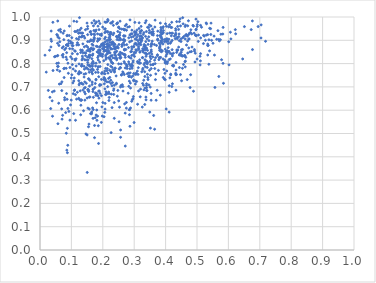
| Category | Series 0 |
|---|---|
| 0.046268062558806666 | 0.83 |
| 0.15444583976947457 | 0.529 |
| 0.4150343035598608 | 0.82 |
| 0.06674241631312527 | 0.714 |
| 0.23873353707904466 | 0.882 |
| 0.06942322071820983 | 0.684 |
| 0.3496310739609766 | 0.592 |
| 0.10916071863495891 | 0.685 |
| 0.23672624397310327 | 0.707 |
| 0.20611554420583666 | 0.768 |
| 0.4370392945514391 | 0.856 |
| 0.11030326053899353 | 0.855 |
| 0.5760919837972039 | 0.926 |
| 0.28432209928627294 | 0.602 |
| 0.25558607697910685 | 0.783 |
| 0.557083852468136 | 0.698 |
| 0.380927852296461 | 0.87 |
| 0.4499849978301955 | 0.849 |
| 0.7038593698856024 | 0.91 |
| 0.5205332399549346 | 0.886 |
| 0.05928487359170098 | 0.943 |
| 0.4029234586882615 | 0.96 |
| 0.055585097784180415 | 0.922 |
| 0.27733381200316143 | 0.779 |
| 0.07720117766723922 | 0.94 |
| 0.2651254018222873 | 0.901 |
| 0.32326188794416566 | 0.942 |
| 0.21986131163515665 | 0.721 |
| 0.06978114934306656 | 0.722 |
| 0.039890570088615296 | 0.574 |
| 0.22964503710954887 | 0.784 |
| 0.01592604561238553 | 0.836 |
| 0.33440312578226006 | 0.695 |
| 0.2861279939554904 | 0.778 |
| 0.24922439567021537 | 0.867 |
| 0.2565942767819751 | 0.782 |
| 0.155034844896076 | 0.861 |
| 0.3989253593538935 | 0.862 |
| 0.27801138823646854 | 0.757 |
| 0.42165388969332307 | 0.833 |
| 0.44393526363814373 | 0.783 |
| 0.09076828118425806 | 0.899 |
| 0.2514026375340046 | 0.882 |
| 0.31088133217762026 | 0.626 |
| 0.3224473445710434 | 0.941 |
| 0.09763300015476772 | 0.829 |
| 0.327269797363018 | 0.774 |
| 0.16332944496035628 | 0.867 |
| 0.05670778822571265 | 0.835 |
| 0.19682919449494418 | 0.883 |
| 0.10340986855159384 | 0.888 |
| 0.18325586904630908 | 0.575 |
| 0.4587079808702146 | 0.833 |
| 0.05603539613845543 | 0.887 |
| 0.1590379467454771 | 0.657 |
| 0.2973928128551725 | 0.659 |
| 0.14175849557697706 | 0.678 |
| 0.10142312682152665 | 0.911 |
| 0.3926652613748488 | 0.958 |
| 0.34888456021274283 | 0.771 |
| 0.21581495159476483 | 0.886 |
| 0.5342072566324625 | 0.837 |
| 0.26948432645099685 | 0.802 |
| 0.3435390219088914 | 0.74 |
| 0.24311679210483583 | 0.712 |
| 0.05340896477550816 | 0.801 |
| 0.2539248833185789 | 0.95 |
| 0.32687196139290997 | 0.826 |
| 0.4474463850421766 | 0.962 |
| 0.2715470045523901 | 0.446 |
| 0.06311236582321977 | 0.894 |
| 0.25157252309778066 | 0.901 |
| 0.19114507729916097 | 0.855 |
| 0.4822968521121065 | 0.852 |
| 0.30447817526712717 | 0.885 |
| 0.34009804318529024 | 0.81 |
| 0.23387174481361583 | 0.885 |
| 0.275210169718335 | 0.796 |
| 0.21197691639285265 | 0.669 |
| 0.17363885838523152 | 0.482 |
| 0.16632267267791656 | 0.721 |
| 0.11234071546425184 | 0.853 |
| 0.23281386059345266 | 0.924 |
| 0.43076572232955435 | 0.907 |
| 0.694776381821852 | 0.959 |
| 0.3117853436208943 | 0.804 |
| 0.2679546881350454 | 0.918 |
| 0.13208220698962947 | 0.644 |
| 0.17870646130817858 | 0.579 |
| 0.5291552246350656 | 0.974 |
| 0.15159002764447138 | 0.95 |
| 0.21545998359438068 | 0.843 |
| 0.18077330451677487 | 0.601 |
| 0.15517023419703668 | 0.68 |
| 0.1522763445244638 | 0.687 |
| 0.05812483713395433 | 0.788 |
| 0.5299610027890114 | 0.922 |
| 0.27547722662576946 | 0.943 |
| 0.1575366891893214 | 0.826 |
| 0.12439000503454123 | 0.799 |
| 0.08899982664697947 | 0.802 |
| 0.16896464225828012 | 0.879 |
| 0.08884104237612156 | 0.607 |
| 0.40329233318184177 | 0.895 |
| 0.16886317519616245 | 0.69 |
| 0.08545673528202202 | 0.429 |
| 0.2320861499835103 | 0.825 |
| 0.2228885994810198 | 0.891 |
| 0.1569830436882529 | 0.605 |
| 0.11652339937243794 | 0.647 |
| 0.2315203847371683 | 0.801 |
| 0.2380757933662493 | 0.838 |
| 0.4078097666478062 | 0.886 |
| 0.5098905060649903 | 0.794 |
| 0.12336108892592412 | 0.651 |
| 0.23958707086673958 | 0.87 |
| 0.1609644830833128 | 0.835 |
| 0.20738621362729504 | 0.629 |
| 0.4917672961582904 | 0.86 |
| 0.1641868084937601 | 0.585 |
| 0.08735555898104641 | 0.921 |
| 0.14399399609529906 | 0.697 |
| 0.3355525100145388 | 0.868 |
| 0.10579501068067632 | 0.777 |
| 0.2260946248825787 | 0.928 |
| 0.1314348528042918 | 0.717 |
| 0.40963238084853615 | 0.958 |
| 0.19621960901225688 | 0.757 |
| 0.1865865976590081 | 0.858 |
| 0.15039736307852214 | 0.333 |
| 0.5096249964828804 | 0.831 |
| 0.1736666915481867 | 0.923 |
| 0.16359558565530552 | 0.927 |
| 0.21883906202532288 | 0.678 |
| 0.17863197249767238 | 0.802 |
| 0.47975943329964477 | 0.752 |
| 0.15976203086230067 | 0.788 |
| 0.24798068031177667 | 0.685 |
| 0.35343479962490454 | 0.933 |
| 0.30505809407267126 | 0.931 |
| 0.3331246018985706 | 0.802 |
| 0.5343457517163476 | 0.877 |
| 0.21917633024693617 | 0.91 |
| 0.14149282720789325 | 0.776 |
| 0.2198254470803147 | 0.876 |
| 0.2602588219462547 | 0.948 |
| 0.4415390851563151 | 0.947 |
| 0.33598265907558067 | 0.917 |
| 0.3915619172878826 | 0.884 |
| 0.6764042062298984 | 0.983 |
| 0.156941806481243 | 0.895 |
| 0.156194809556365 | 0.832 |
| 0.2046023088652167 | 0.757 |
| 0.21602946669111922 | 0.796 |
| 0.3407372873804193 | 0.684 |
| 0.0627822687865669 | 0.767 |
| 0.4036413643748388 | 0.84 |
| 0.35742272447492307 | 0.896 |
| 0.42790438598585845 | 0.918 |
| 0.30142304193956737 | 0.884 |
| 0.15000025252225524 | 0.856 |
| 0.3520741387525659 | 0.75 |
| 0.1365907877211171 | 0.885 |
| 0.3059557600742734 | 0.935 |
| 0.1700810211167736 | 0.772 |
| 0.1429684562293061 | 0.643 |
| 0.17016259620019392 | 0.895 |
| 0.20294936852136136 | 0.732 |
| 0.304636165847741 | 0.887 |
| 0.3856087755657922 | 0.915 |
| 0.46259036737468695 | 0.786 |
| 0.10755562527660845 | 0.725 |
| 0.34765188911577183 | 0.844 |
| 0.4920480217770399 | 0.854 |
| 0.2550212189508192 | 0.982 |
| 0.2866850048522671 | 0.987 |
| 0.6454646681075273 | 0.82 |
| 0.22429741086059674 | 0.904 |
| 0.3178056743514279 | 0.884 |
| 0.3947092355501317 | 0.775 |
| 0.36416570211447785 | 0.882 |
| 0.12653611265096243 | 0.645 |
| 0.3310810752647674 | 0.687 |
| 0.29085216898964716 | 0.787 |
| 0.2898178962113208 | 0.928 |
| 0.09525463815732405 | 0.557 |
| 0.056530813722796 | 0.983 |
| 0.08717381939103375 | 0.522 |
| 0.4660078793938782 | 0.925 |
| 0.5432624413261633 | 0.95 |
| 0.1557745896657623 | 0.734 |
| 0.11517976100235716 | 0.79 |
| 0.3197396917676668 | 0.931 |
| 0.5446778420537252 | 0.974 |
| 0.29075948380432337 | 0.913 |
| 0.2377659628556803 | 0.849 |
| 0.1985959909854642 | 0.831 |
| 0.31371756601027045 | 0.865 |
| 0.43266544797262485 | 0.752 |
| 0.3619649520290197 | 0.577 |
| 0.24156574283963028 | 0.85 |
| 0.11984245806853477 | 0.942 |
| 0.21420872667163182 | 0.98 |
| 0.3385659981889212 | 0.863 |
| 0.38078730424650653 | 0.865 |
| 0.1463593403823824 | 0.498 |
| 0.2680233155499744 | 0.808 |
| 0.29804643680512666 | 0.726 |
| 0.27132106609679674 | 0.588 |
| 0.4776519609133978 | 0.85 |
| 0.2977977703484348 | 0.839 |
| 0.26188845853324516 | 0.709 |
| 0.5666557850917426 | 0.941 |
| 0.1400688742938011 | 0.917 |
| 0.22797267891533157 | 0.805 |
| 0.13698965128500185 | 0.711 |
| 0.39226023195666226 | 0.82 |
| 0.39652692385421806 | 0.894 |
| 0.43539661084322423 | 0.98 |
| 0.16628132936449957 | 0.792 |
| 0.3746133864565788 | 0.904 |
| 0.33325944433163834 | 0.872 |
| 0.1907730616545804 | 0.972 |
| 0.44403127699912903 | 0.98 |
| 0.25469362071726753 | 0.933 |
| 0.45354711319551944 | 0.832 |
| 0.2167492553460958 | 0.899 |
| 0.5380218527715173 | 0.902 |
| 0.34401133997028566 | 0.731 |
| 0.28463816553366295 | 0.827 |
| 0.15464769601705075 | 0.684 |
| 0.4436532511793375 | 0.837 |
| 0.04937925260672993 | 0.831 |
| 0.32686878358050264 | 0.715 |
| 0.11202540390248672 | 0.814 |
| 0.4537019478834474 | 0.78 |
| 0.1251782783285904 | 0.766 |
| 0.21663730299241668 | 0.759 |
| 0.335170648870848 | 0.975 |
| 0.2442064388217462 | 0.816 |
| 0.18389359609989542 | 0.826 |
| 0.11708531992063997 | 0.98 |
| 0.20317636132916617 | 0.812 |
| 0.04151578230001618 | 0.77 |
| 0.32709963926407115 | 0.864 |
| 0.05487713907709957 | 0.833 |
| 0.3393988163067547 | 0.713 |
| 0.45575954319227385 | 0.971 |
| 0.23175221660750456 | 0.98 |
| 0.5696332832846459 | 0.904 |
| 0.34697926529110823 | 0.899 |
| 0.38453471859650323 | 0.826 |
| 0.450392480975602 | 0.859 |
| 0.2568832686062431 | 0.902 |
| 0.1669537399652996 | 0.756 |
| 0.22229669347436753 | 0.824 |
| 0.36552035184663123 | 0.779 |
| 0.30744433104036617 | 0.855 |
| 0.4388327743636966 | 0.858 |
| 0.0906312451646103 | 0.886 |
| 0.1323684923451881 | 0.931 |
| 0.30102204744229066 | 0.831 |
| 0.21484230505039492 | 0.935 |
| 0.22168332175292882 | 0.772 |
| 0.16581484753196174 | 0.883 |
| 0.3127029589032515 | 0.897 |
| 0.6010916615840542 | 0.894 |
| 0.08925039863534989 | 0.876 |
| 0.1456417012680249 | 0.845 |
| 0.3821911725141265 | 0.872 |
| 0.3370680034270672 | 0.894 |
| 0.2751944640066212 | 0.968 |
| 0.34044961320489053 | 0.84 |
| 0.0735700989792083 | 0.828 |
| 0.5400570128121294 | 0.855 |
| 0.1327593052540924 | 0.789 |
| 0.26388188884944064 | 0.702 |
| 0.34243486108704513 | 0.857 |
| 0.1358746248422591 | 0.931 |
| 0.3192535185751103 | 0.657 |
| 0.15167111743775785 | 0.96 |
| 0.21062170726634455 | 0.824 |
| 0.07815056138238252 | 0.78 |
| 0.554338500112225 | 0.918 |
| 0.27158543310835814 | 0.962 |
| 0.44738097522649034 | 0.753 |
| 0.5378283328998473 | 0.797 |
| 0.24556447694753836 | 0.904 |
| 0.3516476951610098 | 0.832 |
| 0.3303292867926615 | 0.729 |
| 0.2709996470132836 | 0.919 |
| 0.09942983931373173 | 0.643 |
| 0.2089975392504595 | 0.779 |
| 0.3574590379468535 | 0.929 |
| 0.23974047447222224 | 0.78 |
| 0.03476337535907037 | 0.871 |
| 0.2031954921226108 | 0.861 |
| 0.22585629824579145 | 0.715 |
| 0.15262425118906398 | 0.609 |
| 0.5822682298114285 | 0.927 |
| 0.3344712304977643 | 0.816 |
| 0.4688757767511551 | 0.731 |
| 0.2595616838802163 | 0.753 |
| 0.2635693009785419 | 0.764 |
| 0.4612470421913196 | 0.835 |
| 0.3651177196446471 | 0.815 |
| 0.11634427759924548 | 0.907 |
| 0.504772809078464 | 0.923 |
| 0.1522650894550207 | 0.794 |
| 0.24350658348405163 | 0.916 |
| 0.04533267249607109 | 0.682 |
| 0.3508918902831092 | 0.829 |
| 0.21318863902179574 | 0.77 |
| 0.4175306913771015 | 0.931 |
| 0.20455059578158896 | 0.881 |
| 0.14688025146947759 | 0.815 |
| 0.3753666103039761 | 0.9 |
| 0.6231436607795283 | 0.928 |
| 0.1879322211097313 | 0.844 |
| 0.5342059542936813 | 0.884 |
| 0.2248274833511007 | 0.832 |
| 0.22511281606354594 | 0.816 |
| 0.2052404249007238 | 0.737 |
| 0.3988693789171235 | 0.731 |
| 0.22937872144014027 | 0.891 |
| 0.2607804474261757 | 0.845 |
| 0.326177076767313 | 0.826 |
| 0.17140306203174305 | 0.903 |
| 0.2463047550742129 | 0.66 |
| 0.32957463360224426 | 0.707 |
| 0.23603809308801604 | 0.886 |
| 0.18432046183109652 | 0.907 |
| 0.0535412201412826 | 0.925 |
| 0.42004949882233467 | 0.842 |
| 0.3077490141520193 | 0.723 |
| 0.39049511472935206 | 0.902 |
| 0.46429498552500004 | 0.827 |
| 0.1854134180952305 | 0.832 |
| 0.18288265072692933 | 0.873 |
| 0.15607017778439902 | 0.541 |
| 0.2818183266158252 | 0.869 |
| 0.1611950167929358 | 0.773 |
| 0.20898035990514408 | 0.833 |
| 0.43649477325090347 | 0.912 |
| 0.21577869051090393 | 0.989 |
| 0.3267306589832508 | 0.91 |
| 0.24825000738444913 | 0.913 |
| 0.17296125673371976 | 0.907 |
| 0.268522841592151 | 0.944 |
| 0.14266556298780364 | 0.721 |
| 0.26573572433151804 | 0.841 |
| 0.4975304909347029 | 0.948 |
| 0.31992681693600056 | 0.802 |
| 0.2700794013497456 | 0.947 |
| 0.082953866767015 | 0.828 |
| 0.1173016543088361 | 0.88 |
| 0.15877574943345862 | 0.728 |
| 0.3771550898087006 | 0.771 |
| 0.18317021155805346 | 0.896 |
| 0.3835967985189226 | 0.934 |
| 0.3931133277175376 | 0.942 |
| 0.4700354854842582 | 0.897 |
| 0.23717238071614544 | 0.764 |
| 0.22946320117663022 | 0.611 |
| 0.3307778487758911 | 0.875 |
| 0.32349960643039066 | 0.903 |
| 0.4841435257126896 | 0.871 |
| 0.30142377093140327 | 0.936 |
| 0.16656371424580485 | 0.777 |
| 0.2049217911006075 | 0.713 |
| 0.19570120068149321 | 0.927 |
| 0.2593986706625988 | 0.751 |
| 0.08848688967715135 | 0.449 |
| 0.313170184315091 | 0.783 |
| 0.5510224466480231 | 0.887 |
| 0.3856995984596219 | 0.946 |
| 0.4080955984972874 | 0.868 |
| 0.21574537372239855 | 0.937 |
| 0.05865411027810541 | 0.802 |
| 0.2467229853780708 | 0.975 |
| 0.2532740639227057 | 0.613 |
| 0.2663542234033035 | 0.919 |
| 0.43525198318159797 | 0.848 |
| 0.31548434214617616 | 0.883 |
| 0.45698970738831646 | 0.796 |
| 0.08476682173321959 | 0.881 |
| 0.19867721057827592 | 0.865 |
| 0.35341681475866504 | 0.961 |
| 0.15170454078239026 | 0.895 |
| 0.28274710677074344 | 0.911 |
| 0.5402280879623256 | 0.951 |
| 0.21029111610409335 | 0.679 |
| 0.310080954755209 | 0.768 |
| 0.17097866417863072 | 0.801 |
| 0.4944320529594358 | 0.845 |
| 0.20010418676244435 | 0.633 |
| 0.24614184243529358 | 0.873 |
| 0.2574910950635678 | 0.827 |
| 0.2825163753858875 | 0.746 |
| 0.28828533469199347 | 0.695 |
| 0.3083978276685305 | 0.944 |
| 0.27637161647850583 | 0.881 |
| 0.46905293812916504 | 0.918 |
| 0.6019764608664719 | 0.795 |
| 0.23170506783224798 | 0.893 |
| 0.2506210203043103 | 0.64 |
| 0.18705573278365173 | 0.744 |
| 0.2657898732824775 | 0.947 |
| 0.22661387531175714 | 0.81 |
| 0.356119726196497 | 0.841 |
| 0.20591056023520315 | 0.906 |
| 0.11313059340277765 | 0.557 |
| 0.10312596095646553 | 0.796 |
| 0.1447886377708224 | 0.945 |
| 0.33343958855642 | 0.765 |
| 0.05711174750272119 | 0.542 |
| 0.3913035747499565 | 0.954 |
| 0.15458251312515647 | 0.735 |
| 0.06596825338998147 | 0.936 |
| 0.16189887749800558 | 0.898 |
| 0.4070944880536249 | 0.849 |
| 0.1341913738942181 | 0.854 |
| 0.14305238755597516 | 0.847 |
| 0.3340081953025489 | 0.745 |
| 0.339378493421822 | 0.706 |
| 0.29622696535151294 | 0.649 |
| 0.41271810598477576 | 0.967 |
| 0.4020374608055196 | 0.807 |
| 0.0970003070940958 | 0.895 |
| 0.7042927508019918 | 0.966 |
| 0.26962132417572926 | 0.627 |
| 0.26867341155044877 | 0.859 |
| 0.3739229840717786 | 0.834 |
| 0.19256032554830071 | 0.874 |
| 0.4430137940246943 | 0.927 |
| 0.1620404606415582 | 0.902 |
| 0.13335081190647824 | 0.797 |
| 0.3982078469144986 | 0.806 |
| 0.12463398594731412 | 0.759 |
| 0.3172561176222066 | 0.816 |
| 0.2554214815466187 | 0.907 |
| 0.24011772316889868 | 0.864 |
| 0.10265884437000028 | 0.878 |
| 0.20451019834863238 | 0.859 |
| 0.16474575597252472 | 0.764 |
| 0.2501957325651698 | 0.917 |
| 0.26877427201413384 | 0.861 |
| 0.46246913215822083 | 0.906 |
| 0.23245029399424466 | 0.888 |
| 0.19038250110472243 | 0.844 |
| 0.0848728293092047 | 0.847 |
| 0.21660438875694776 | 0.984 |
| 0.5842971265258475 | 0.715 |
| 0.08724439070209888 | 0.418 |
| 0.24439636868090386 | 0.853 |
| 0.23167117103335866 | 0.886 |
| 0.3016598981969577 | 0.935 |
| 0.2160656694423938 | 0.864 |
| 0.4049728828208389 | 0.8 |
| 0.1337113652768761 | 0.816 |
| 0.3139937056733155 | 0.888 |
| 0.320215288478911 | 0.69 |
| 0.7183277874992718 | 0.896 |
| 0.29311460211797913 | 0.78 |
| 0.33586936576724924 | 0.876 |
| 0.26955419838320893 | 0.897 |
| 0.2477369794571106 | 0.938 |
| 0.09319412863461773 | 0.92 |
| 0.10908058532289344 | 0.738 |
| 0.1568172998870644 | 0.763 |
| 0.34149951393735356 | 0.799 |
| 0.3888711615479611 | 0.928 |
| 0.3377189427744799 | 0.844 |
| 0.1374664020492783 | 0.846 |
| 0.4608536053960657 | 0.834 |
| 0.2984021130620649 | 0.73 |
| 0.15661395811659273 | 0.854 |
| 0.3499598438999735 | 0.809 |
| 0.10374195858385071 | 0.863 |
| 0.13477063357106833 | 0.858 |
| 0.5003083997597775 | 0.82 |
| 0.07860013790697618 | 0.86 |
| 0.2608766648686738 | 0.873 |
| 0.30673801867839134 | 0.759 |
| 0.4635031054318841 | 0.965 |
| 0.40363635084517213 | 0.768 |
| 0.17586420443602746 | 0.568 |
| 0.17715760629922794 | 0.762 |
| 0.2861005254034622 | 0.922 |
| 0.3039025601748614 | 0.923 |
| 0.17702436656689036 | 0.79 |
| 0.23498604207052765 | 0.931 |
| 0.22383918661314617 | 0.869 |
| 0.05499731057123114 | 0.773 |
| 0.4965853685527166 | 0.991 |
| 0.36874634436102816 | 0.756 |
| 0.11924837635686136 | 0.841 |
| 0.1856915639571146 | 0.533 |
| 0.4319748272249436 | 0.924 |
| 0.16856171163195022 | 0.68 |
| 0.4384477614552913 | 0.96 |
| 0.1258042908669298 | 0.997 |
| 0.08228750832912368 | 0.866 |
| 0.16517029713771303 | 0.801 |
| 0.5440346429764786 | 0.925 |
| 0.3667218519726374 | 0.8 |
| 0.28718613126640846 | 0.76 |
| 0.19957176866075976 | 0.957 |
| 0.2352200202615432 | 0.691 |
| 0.3397257197696193 | 0.684 |
| 0.2292486765192291 | 0.863 |
| 0.17868717695476477 | 0.944 |
| 0.41950906867274584 | 0.977 |
| 0.31891598284320477 | 0.852 |
| 0.28768615824968546 | 0.716 |
| 0.49355495791529747 | 0.807 |
| 0.3864557752961958 | 0.89 |
| 0.25150128667874994 | 0.922 |
| 0.22936062740891083 | 0.835 |
| 0.2849339353787129 | 0.581 |
| 0.25675017643799836 | 0.515 |
| 0.3732887550282874 | 0.685 |
| 0.17473376158220266 | 0.697 |
| 0.123081769557844 | 0.881 |
| 0.1937545946504975 | 0.843 |
| 0.16593595405383066 | 0.863 |
| 0.1060071292081467 | 0.671 |
| 0.36051005906103595 | 0.922 |
| 0.1422098041640696 | 0.817 |
| 0.18520040482330968 | 0.762 |
| 0.43200009702550024 | 0.925 |
| 0.44911715762797244 | 0.895 |
| 0.422225695477337 | 0.93 |
| 0.07575683294634072 | 0.778 |
| 0.24426887782183437 | 0.916 |
| 0.16954393438383442 | 0.603 |
| 0.48051726487892743 | 0.945 |
| 0.4887619032062194 | 0.681 |
| 0.31393452161519453 | 0.683 |
| 0.44380550754983317 | 0.898 |
| 0.34805253498649535 | 0.943 |
| 0.14779501086736946 | 0.876 |
| 0.16136167330222018 | 0.938 |
| 0.382547713688948 | 0.88 |
| 0.1698956934597945 | 0.655 |
| 0.19769182245374795 | 0.762 |
| 0.30377063419639616 | 0.712 |
| 0.42515791243712486 | 0.789 |
| 0.06039821702559944 | 0.878 |
| 0.18331314776740215 | 0.927 |
| 0.07338584864194198 | 0.84 |
| 0.12255055998886766 | 0.904 |
| 0.2067102503804943 | 0.692 |
| 0.3897390977718064 | 0.854 |
| 0.23485940310865172 | 0.668 |
| 0.31399387674808266 | 0.872 |
| 0.19832390882318063 | 0.575 |
| 0.27513602234310186 | 0.633 |
| 0.1846855201622073 | 0.961 |
| 0.4329867920303049 | 0.686 |
| 0.11298473594723879 | 0.768 |
| 0.461837182726506 | 0.808 |
| 0.3862853156741235 | 0.851 |
| 0.416414306375381 | 0.956 |
| 0.2890783162461392 | 0.851 |
| 0.4112560991460569 | 0.817 |
| 0.12349609850392607 | 0.726 |
| 0.5011431598211572 | 0.967 |
| 0.19398030236502406 | 0.709 |
| 0.4174510783887132 | 0.893 |
| 0.21822974185848876 | 0.736 |
| 0.6063149396590678 | 0.935 |
| 0.15212944026298414 | 0.805 |
| 0.5209348852205687 | 0.921 |
| 0.36040206601878766 | 0.937 |
| 0.311818154745202 | 0.924 |
| 0.4321003331065758 | 0.758 |
| 0.2643591760974279 | 0.682 |
| 0.21316469010338612 | 0.899 |
| 0.16348116153609082 | 0.925 |
| 0.33524441369771296 | 0.859 |
| 0.2554476672896593 | 0.848 |
| 0.1667248506608786 | 0.788 |
| 0.6726869025704668 | 0.946 |
| 0.16865950715689493 | 0.81 |
| 0.6510459487691821 | 0.959 |
| 0.30571539074743004 | 0.86 |
| 0.3275879651052894 | 0.858 |
| 0.4249444628368 | 0.844 |
| 0.5341063068204944 | 0.924 |
| 0.19382499209423143 | 0.835 |
| 0.4218868933707387 | 0.792 |
| 0.19717377607876385 | 0.614 |
| 0.2060783061299155 | 0.871 |
| 0.5112659301554505 | 0.843 |
| 0.17833921254989316 | 0.732 |
| 0.29619921919085745 | 0.806 |
| 0.4182879958483754 | 0.919 |
| 0.22724824467191806 | 0.669 |
| 0.08378048301691587 | 0.501 |
| 0.40493486664843015 | 0.848 |
| 0.1262208485011621 | 0.715 |
| 0.40292588201496593 | 0.905 |
| 0.31576566852016485 | 0.975 |
| 0.09030358593298637 | 0.758 |
| 0.212044707545047 | 0.84 |
| 0.3748736328486616 | 0.904 |
| 0.20974690437605392 | 0.938 |
| 0.13512621069860564 | 0.832 |
| 0.35533217941180417 | 0.887 |
| 0.3822947729956985 | 0.92 |
| 0.3022232714869316 | 0.977 |
| 0.27091456762199806 | 0.836 |
| 0.13292089288794995 | 0.715 |
| 0.17822092192506245 | 0.73 |
| 0.21219752944248182 | 0.883 |
| 0.17603127308645306 | 0.715 |
| 0.502892462067273 | 0.98 |
| 0.12816354758588422 | 0.683 |
| 0.28226183021205287 | 0.83 |
| 0.09739277111897804 | 0.623 |
| 0.33155697311678134 | 0.796 |
| 0.29148955735274273 | 0.852 |
| 0.2608063469825046 | 0.882 |
| 0.28238702911554814 | 0.808 |
| 0.34634518977490325 | 0.955 |
| 0.14496358583012037 | 0.834 |
| 0.3209612860012775 | 0.881 |
| 0.3483496047423311 | 0.966 |
| 0.33796274254819536 | 0.806 |
| 0.14025873591699634 | 0.755 |
| 0.1702705525321122 | 0.901 |
| 0.48710809997959525 | 0.964 |
| 0.1442452679455295 | 0.67 |
| 0.3857066541028594 | 0.859 |
| 0.32054254982345065 | 0.899 |
| 0.2824531528226242 | 0.759 |
| 0.22327284447882478 | 0.933 |
| 0.33924241726511284 | 0.696 |
| 0.1906634216058457 | 0.924 |
| 0.46650162943073514 | 0.88 |
| 0.17973462290332531 | 0.979 |
| 0.2020048233232632 | 0.888 |
| 0.08175433622042816 | 0.59 |
| 0.10304526883595211 | 0.843 |
| 0.401855147177665 | 0.605 |
| 0.340870875855081 | 0.906 |
| 0.23073678006861498 | 0.718 |
| 0.27496328901229283 | 0.609 |
| 0.22564996626707867 | 0.728 |
| 0.15115153615494592 | 0.828 |
| 0.3275482513296387 | 0.78 |
| 0.321920598800998 | 0.96 |
| 0.34211975895483515 | 0.754 |
| 0.16967982794972902 | 0.691 |
| 0.3926380635524722 | 0.74 |
| 0.26567956314594654 | 0.889 |
| 0.2918822303066001 | 0.872 |
| 0.5356190905247703 | 0.878 |
| 0.1652055262590788 | 0.975 |
| 0.35672487788124907 | 0.925 |
| 0.18304347078001404 | 0.775 |
| 0.08576110630541778 | 0.919 |
| 0.2700096938670017 | 0.859 |
| 0.2777091069986768 | 0.789 |
| 0.19149981235073055 | 0.788 |
| 0.1310623932511058 | 0.914 |
| 0.1840714974007418 | 0.849 |
| 0.17934389245976134 | 0.874 |
| 0.30369374535792704 | 0.754 |
| 0.38318740681664165 | 0.665 |
| 0.1847995781743622 | 0.662 |
| 0.24986579225134342 | 0.955 |
| 0.1953498021948037 | 0.921 |
| 0.15307027141006246 | 0.816 |
| 0.1593734621087013 | 0.936 |
| 0.33946353198506796 | 0.866 |
| 0.1684755405593268 | 0.841 |
| 0.31741442060717173 | 0.916 |
| 0.20727097382518356 | 0.605 |
| 0.23448758933348268 | 0.876 |
| 0.3924912679727951 | 0.932 |
| 0.19010337852176284 | 0.705 |
| 0.1601920864336318 | 0.861 |
| 0.13210763156484817 | 0.791 |
| 0.2975666178151629 | 0.873 |
| 0.3610420194893824 | 0.928 |
| 0.5144046540107143 | 0.956 |
| 0.24343117490339328 | 0.716 |
| 0.3345770877336258 | 0.844 |
| 0.21548153789101288 | 0.701 |
| 0.18799550867711612 | 0.946 |
| 0.47410921865832156 | 0.925 |
| 0.2827160297201121 | 0.702 |
| 0.22049280440074337 | 0.925 |
| 0.35653585855424774 | 0.883 |
| 0.25842839117309346 | 0.799 |
| 0.3786800530086971 | 0.817 |
| 0.32977346963343757 | 0.862 |
| 0.2655936638312023 | 0.903 |
| 0.22375616015297572 | 0.924 |
| 0.23368963403617038 | 0.964 |
| 0.46226448216033456 | 0.959 |
| 0.18005809222949243 | 0.632 |
| 0.1899821970188057 | 0.807 |
| 0.1568940085306637 | 0.656 |
| 0.24245003802071796 | 0.747 |
| 0.15954193529417582 | 0.853 |
| 0.17662315590839806 | 0.938 |
| 0.4980247227003447 | 0.92 |
| 0.12689333543257364 | 0.945 |
| 0.07852047321643896 | 0.654 |
| 0.20019879057515655 | 0.84 |
| 0.31589339292518315 | 0.801 |
| 0.2945275091856939 | 0.792 |
| 0.4415491155874327 | 0.871 |
| 0.13559807176074334 | 0.823 |
| 0.33727014005651734 | 0.656 |
| 0.07853675361370205 | 0.644 |
| 0.07417989959963311 | 0.872 |
| 0.3041325658666796 | 0.846 |
| 0.47581021356491326 | 0.93 |
| 0.4324679603211432 | 0.943 |
| 0.32877833217142227 | 0.85 |
| 0.17252027887548693 | 0.985 |
| 0.3031317028387259 | 0.924 |
| 0.3832181193480846 | 0.974 |
| 0.14740145476000222 | 0.716 |
| 0.12783851313035965 | 0.932 |
| 0.16706366726377686 | 0.835 |
| 0.23843434219624693 | 0.863 |
| 0.490795130027862 | 0.93 |
| 0.29277927084200384 | 0.943 |
| 0.41139852097247054 | 0.592 |
| 0.15765733213500666 | 0.703 |
| 0.43204981681993604 | 0.95 |
| 0.17382435642306737 | 0.535 |
| 0.2342012597206582 | 0.685 |
| 0.18775566196554427 | 0.652 |
| 0.4208284613540316 | 0.899 |
| 0.4950403615386666 | 0.922 |
| 0.2445835158621137 | 0.821 |
| 0.20835145974296443 | 0.725 |
| 0.15396187653832505 | 0.776 |
| 0.38107102939259574 | 0.824 |
| 0.23801954761459732 | 0.823 |
| 0.3530761988061031 | 0.821 |
| 0.4145528532161499 | 0.844 |
| 0.21557959756539813 | 0.849 |
| 0.31035487393506445 | 0.809 |
| 0.19926059325561896 | 0.884 |
| 0.21970569208824342 | 0.671 |
| 0.41358087671006105 | 0.739 |
| 0.4741595009587143 | 0.904 |
| 0.21643742923510134 | 0.849 |
| 0.24607792124916972 | 0.972 |
| 0.22648013732499683 | 0.504 |
| 0.3422745659730503 | 0.804 |
| 0.21432033778282766 | 0.778 |
| 0.4963798483046624 | 0.945 |
| 0.21583155859745073 | 0.873 |
| 0.3340933248504816 | 0.864 |
| 0.20695039231460233 | 0.756 |
| 0.5695732821629517 | 0.745 |
| 0.31433940692220574 | 0.861 |
| 0.3082470756639043 | 0.914 |
| 0.031548304704047014 | 0.655 |
| 0.3039367915380027 | 0.725 |
| 0.35340050678847623 | 0.849 |
| 0.180393023578708 | 0.672 |
| 0.3584512917651618 | 0.948 |
| 0.4330767303335039 | 0.805 |
| 0.219523109943066 | 0.642 |
| 0.18556706000154055 | 0.815 |
| 0.30853213458960316 | 0.88 |
| 0.21992877870156124 | 0.848 |
| 0.19563825657415201 | 0.662 |
| 0.5465225601822931 | 0.9 |
| 0.30683137285700723 | 0.755 |
| 0.2080214502530512 | 0.732 |
| 0.2795459779429761 | 0.957 |
| 0.13503872319486643 | 0.918 |
| 0.039481342183408374 | 0.679 |
| 0.33090519008455 | 0.933 |
| 0.4547012932985377 | 0.911 |
| 0.20687871939275015 | 0.978 |
| 0.23869152678324979 | 0.781 |
| 0.3004418209902061 | 0.848 |
| 0.2957656022941897 | 0.747 |
| 0.2808189795644459 | 0.673 |
| 0.41952109269777926 | 0.955 |
| 0.0736370593144845 | 0.93 |
| 0.11902682523209873 | 0.677 |
| 0.20556420891274918 | 0.948 |
| 0.30800506845217324 | 0.903 |
| 0.5829258833868952 | 0.801 |
| 0.24551251814192532 | 0.869 |
| 0.29346776992479895 | 0.786 |
| 0.22522737532351755 | 0.789 |
| 0.17584230127515776 | 0.972 |
| 0.462986104629318 | 0.811 |
| 0.38567695968794014 | 0.897 |
| 0.3741336555873215 | 0.92 |
| 0.4049609362513158 | 0.929 |
| 0.38529723900726376 | 0.941 |
| 0.4252588884011713 | 0.793 |
| 0.35415298886926716 | 0.779 |
| 0.19087094517696224 | 0.841 |
| 0.2539656573904715 | 0.922 |
| 0.4420691742028531 | 0.916 |
| 0.3608823631041692 | 0.797 |
| 0.0648723250719877 | 0.947 |
| 0.1501815818685026 | 0.652 |
| 0.1849151701591807 | 0.787 |
| 0.06163796815753175 | 0.712 |
| 0.23651429420192438 | 0.565 |
| 0.2006256817423887 | 0.877 |
| 0.15200697040021904 | 0.87 |
| 0.29859242740175673 | 0.757 |
| 0.2100597790138965 | 0.977 |
| 0.1597972547621278 | 0.861 |
| 0.13019338818545656 | 0.621 |
| 0.13874607851819043 | 0.598 |
| 0.3175668152273986 | 0.905 |
| 0.4699144833108464 | 0.92 |
| 0.18587145344322742 | 0.785 |
| 0.10141396309891981 | 0.752 |
| 0.40125556302175625 | 0.852 |
| 0.23760284804326093 | 0.777 |
| 0.5266308888007221 | 0.9 |
| 0.4360819397296447 | 0.859 |
| 0.08392331073464121 | 0.88 |
| 0.40187245664852433 | 0.896 |
| 0.17027436172299437 | 0.962 |
| 0.35343083969081424 | 0.874 |
| 0.07083057499788681 | 0.867 |
| 0.3666027960266799 | 0.986 |
| 0.05955811989894322 | 0.63 |
| 0.11093892048877729 | 0.938 |
| 0.32575923064209356 | 0.613 |
| 0.11496252047711542 | 0.821 |
| 0.08531046713934742 | 0.818 |
| 0.44896658671305856 | 0.906 |
| 0.2916806482993185 | 0.898 |
| 0.12200761571576535 | 0.758 |
| 0.3799533425718219 | 0.888 |
| 0.2042083711531335 | 0.74 |
| 0.26768603258225654 | 0.919 |
| 0.030539268529438557 | 0.857 |
| 0.2520556704887461 | 0.777 |
| 0.6220967756778046 | 0.946 |
| 0.2714378217019272 | 0.827 |
| 0.5745638308306 | 0.902 |
| 0.32701611123131025 | 0.856 |
| 0.4832846344231664 | 0.927 |
| 0.530513967075422 | 0.971 |
| 0.35172828866393735 | 0.523 |
| 0.4464026006148961 | 0.992 |
| 0.5040576198105355 | 0.895 |
| 0.510885692166886 | 0.812 |
| 0.14030704112913583 | 0.788 |
| 0.12382645856670027 | 0.755 |
| 0.14978217512364855 | 0.974 |
| 0.22329271870252387 | 0.846 |
| 0.3539489865912594 | 0.672 |
| 0.2919634380849342 | 0.797 |
| 0.33548566918911615 | 0.787 |
| 0.31212836790278964 | 0.754 |
| 0.3699191462002712 | 0.643 |
| 0.2127578380893429 | 0.673 |
| 0.5003513733454659 | 0.959 |
| 0.1782203702267532 | 0.664 |
| 0.2900830777280232 | 0.823 |
| 0.1366064260467279 | 0.687 |
| 0.23646095885791385 | 0.633 |
| 0.5229751119913346 | 0.918 |
| 0.25805836534671234 | 0.706 |
| 0.28410281848375496 | 0.798 |
| 0.2758895681311442 | 0.79 |
| 0.22831107284317376 | 0.974 |
| 0.3289034195665428 | 0.925 |
| 0.4704224924016345 | 0.962 |
| 0.3977208070909327 | 0.758 |
| 0.20825248253228745 | 0.913 |
| 0.19565856051784714 | 0.732 |
| 0.29312528659726256 | 0.928 |
| 0.22949997168817338 | 0.705 |
| 0.07596321971950237 | 0.903 |
| 0.35447447144542454 | 0.853 |
| 0.07206752372738545 | 0.578 |
| 0.39619979711731357 | 0.734 |
| 0.1518328252485983 | 0.924 |
| 0.1471350502093075 | 0.781 |
| 0.0864384785584964 | 0.647 |
| 0.20395609188354558 | 0.872 |
| 0.19898629096390308 | 0.882 |
| 0.12529482363616873 | 0.914 |
| 0.4503791865639928 | 0.837 |
| 0.09462630658953253 | 0.864 |
| 0.2695387771422517 | 0.839 |
| 0.3526882003462607 | 0.795 |
| 0.22232359062462947 | 0.741 |
| 0.5112239963328259 | 0.964 |
| 0.4207941615592171 | 0.86 |
| 0.14132324777806715 | 0.872 |
| 0.18977868918711926 | 0.871 |
| 0.19021559433232693 | 0.71 |
| 0.3478522262212901 | 0.932 |
| 0.2704279427907058 | 0.838 |
| 0.3204906887305178 | 0.918 |
| 0.4373352227598748 | 0.907 |
| 0.4063148807584904 | 0.807 |
| 0.3750531991091598 | 0.939 |
| 0.1959872419999158 | 0.882 |
| 0.2969513468591456 | 0.916 |
| 0.3380183313702547 | 0.984 |
| 0.22085676267914667 | 0.901 |
| 0.4544902451923182 | 0.997 |
| 0.19080000289587207 | 0.836 |
| 0.1572142945922801 | 0.837 |
| 0.6079514101065169 | 0.906 |
| 0.4105026574064674 | 0.905 |
| 0.3996207212382572 | 0.971 |
| 0.21339015741679268 | 0.721 |
| 0.10808519946490691 | 0.982 |
| 0.5116615774330426 | 0.91 |
| 0.36811017715798444 | 0.825 |
| 0.1117029318709909 | 0.819 |
| 0.36579380523621474 | 0.957 |
| 0.2538749499049321 | 0.825 |
| 0.2278277447559105 | 0.883 |
| 0.14049455612614792 | 0.742 |
| 0.28541292575377586 | 0.603 |
| 0.24162893200739155 | 0.834 |
| 0.41633283564249146 | 0.752 |
| 0.12452122888951012 | 0.709 |
| 0.33873139315176637 | 0.938 |
| 0.22588435076108215 | 0.933 |
| 0.3975917632020032 | 0.815 |
| 0.12980926272566584 | 0.848 |
| 0.2313827059608694 | 0.802 |
| 0.45404095985344495 | 0.861 |
| 0.1295621469911118 | 0.58 |
| 0.35427417250856297 | 0.859 |
| 0.3239901302113758 | 0.765 |
| 0.2518676452538243 | 0.55 |
| 0.14148539468200938 | 0.695 |
| 0.3711100087942615 | 0.878 |
| 0.2508255449523519 | 0.957 |
| 0.26528826138933015 | 0.76 |
| 0.472692042752727 | 0.984 |
| 0.2362793428782768 | 0.865 |
| 0.20984450252341125 | 0.819 |
| 0.22252823566402802 | 0.915 |
| 0.3676830410095353 | 0.731 |
| 0.4579562183304149 | 0.916 |
| 0.22036465821373674 | 0.655 |
| 0.18740633977416588 | 0.982 |
| 0.19146450250132163 | 0.672 |
| 0.17122106930170555 | 0.864 |
| 0.26147382056080415 | 0.88 |
| 0.2505588673294642 | 0.799 |
| 0.13471620953098162 | 0.917 |
| 0.404449742358293 | 0.907 |
| 0.2690584376807198 | 0.88 |
| 0.4745320715422652 | 0.907 |
| 0.17282683402986432 | 0.912 |
| 0.47052594905087197 | 0.845 |
| 0.4780017408801537 | 0.697 |
| 0.35913170503617686 | 0.829 |
| 0.22064207727053686 | 0.878 |
| 0.21789703035745622 | 0.825 |
| 0.026506114111864654 | 0.685 |
| 0.31884058715615005 | 0.938 |
| 0.16887727008569375 | 0.565 |
| 0.5831906001822328 | 0.955 |
| 0.15361088600900163 | 0.689 |
| 0.16829847539779985 | 0.859 |
| 0.2986416907296292 | 0.872 |
| 0.03556647590489803 | 0.94 |
| 0.4795505260930566 | 0.933 |
| 0.3441006827452957 | 0.882 |
| 0.2882670947899286 | 0.791 |
| 0.292035744130812 | 0.638 |
| 0.3912806586403028 | 0.933 |
| 0.2532887176949078 | 0.912 |
| 0.16530960219527469 | 0.821 |
| 0.10743029475808152 | 0.585 |
| 0.0953880236087501 | 0.783 |
| 0.3426165945131371 | 0.956 |
| 0.14560870273062998 | 0.757 |
| 0.43231787703721214 | 0.93 |
| 0.41108163354274974 | 0.853 |
| 0.4634799240070552 | 0.921 |
| 0.5782837042142918 | 0.817 |
| 0.5556159387195828 | 0.837 |
| 0.17243581384446716 | 0.928 |
| 0.16100514578687464 | 0.585 |
| 0.2997431681354322 | 0.547 |
| 0.38746309531425094 | 0.892 |
| 0.38469458905116793 | 0.913 |
| 0.20872861069479165 | 0.667 |
| 0.055860830613130186 | 0.788 |
| 0.4011953975903376 | 0.832 |
| 0.34144942703913417 | 0.783 |
| 0.4058286359302876 | 0.855 |
| 0.20790997681594803 | 0.893 |
| 0.3809498328351757 | 0.857 |
| 0.08450136998947189 | 0.671 |
| 0.3849569610126907 | 0.897 |
| 0.09958009343225838 | 0.739 |
| 0.3993624690524623 | 0.802 |
| 0.1674245010687283 | 0.61 |
| 0.2441531040935705 | 0.97 |
| 0.12424603896143827 | 0.932 |
| 0.16897995729769755 | 0.86 |
| 0.08336334487008135 | 0.78 |
| 0.3872771304510616 | 0.926 |
| 0.13187026147540126 | 0.642 |
| 0.09385446900548167 | 0.961 |
| 0.03658253745358808 | 0.896 |
| 0.07090132725409126 | 0.835 |
| 0.2064321502433336 | 0.591 |
| 0.09845807405342144 | 0.888 |
| 0.3336373400435273 | 0.625 |
| 0.34687157972467286 | 0.709 |
| 0.22479682619733432 | 0.974 |
| 0.034040424334154995 | 0.607 |
| 0.1867487655977954 | 0.682 |
| 0.18141172139002415 | 0.556 |
| 0.4345762001959278 | 0.753 |
| 0.48864874539801917 | 0.961 |
| 0.15792809469740288 | 0.793 |
| 0.29252318298352675 | 0.863 |
| 0.12948026026738413 | 0.858 |
| 0.22518443333127347 | 0.862 |
| 0.2182455070529783 | 0.855 |
| 0.3880681388841756 | 0.908 |
| 0.3463895220232901 | 0.915 |
| 0.23865818043459952 | 0.845 |
| 0.15014101833910298 | 0.494 |
| 0.21069682904328635 | 0.855 |
| 0.3377014160855628 | 0.644 |
| 0.3557624070254696 | 0.935 |
| 0.2910287773457241 | 0.742 |
| 0.25473884302857985 | 0.834 |
| 0.28651523078719376 | 0.531 |
| 0.27338039466540187 | 0.861 |
| 0.2066192632044026 | 0.933 |
| 0.31538428564644827 | 0.951 |
| 0.06904033509969243 | 0.606 |
| 0.2845516207523954 | 0.725 |
| 0.061247588098010675 | 0.909 |
| 0.176699253030151 | 0.674 |
| 0.2226649124730562 | 0.819 |
| 0.11283645569633294 | 0.667 |
| 0.23733221989335196 | 0.768 |
| 0.07025605635313792 | 0.562 |
| 0.13109427442107957 | 0.952 |
| 0.4113718199239943 | 0.677 |
| 0.4460970526659772 | 0.842 |
| 0.3237602625753183 | 0.898 |
| 0.2264389969942423 | 0.765 |
| 0.2713001652688398 | 0.781 |
| 0.18205931388827723 | 0.664 |
| 0.5627367690440261 | 0.904 |
| 0.3740473447175381 | 0.838 |
| 0.12272565046046202 | 0.93 |
| 0.29217874137441746 | 0.835 |
| 0.4162086120738915 | 0.755 |
| 0.41168958304677805 | 0.705 |
| 0.28346650639025095 | 0.744 |
| 0.18904645467587655 | 0.682 |
| 0.31524718127206686 | 0.807 |
| 0.03865978193101349 | 0.64 |
| 0.18724182860982164 | 0.902 |
| 0.2560077623684708 | 0.823 |
| 0.4332136595268522 | 0.772 |
| 0.2040439388238211 | 0.572 |
| 0.09205247595338462 | 0.595 |
| 0.3543001280174459 | 0.881 |
| 0.1649210050629194 | 0.592 |
| 0.11916725079165502 | 0.889 |
| 0.3319546842167286 | 0.882 |
| 0.5713165133498729 | 0.898 |
| 0.11041201301827464 | 0.687 |
| 0.4509192956303826 | 0.726 |
| 0.3850745566586422 | 0.955 |
| 0.191095096692531 | 0.858 |
| 0.18202642170498895 | 0.85 |
| 0.2965525909720256 | 0.812 |
| 0.26846335495563434 | 0.753 |
| 0.32070715287409335 | 0.89 |
| 0.24336341664082006 | 0.823 |
| 0.1486895859771552 | 0.781 |
| 0.35389533285549135 | 0.643 |
| 0.42173312149347875 | 0.713 |
| 0.14255836884240658 | 0.91 |
| 0.26890679547967644 | 0.902 |
| 0.29418715648254024 | 0.645 |
| 0.01997082814828055 | 0.763 |
| 0.16580818677287879 | 0.71 |
| 0.2846075872197781 | 0.748 |
| 0.21111790258439211 | 0.857 |
| 0.19065098646804235 | 0.907 |
| 0.41290464483246236 | 0.931 |
| 0.38759707159544254 | 0.931 |
| 0.35106324555833823 | 0.699 |
| 0.15694959964361477 | 0.791 |
| 0.2848559808063793 | 0.959 |
| 0.10480240564328358 | 0.717 |
| 0.676709665379124 | 0.86 |
| 0.25665590960042983 | 0.484 |
| 0.25451624844270726 | 0.839 |
| 0.318164043814942 | 0.849 |
| 0.0768617200616385 | 0.74 |
| 0.11471269009016494 | 0.937 |
| 0.2855292844086591 | 0.893 |
| 0.220065832239156 | 0.878 |
| 0.3033383405670975 | 0.905 |
| 0.41996534847284395 | 0.702 |
| 0.2036960960765516 | 0.853 |
| 0.3231695809001023 | 0.917 |
| 0.21256741350347774 | 0.871 |
| 0.36504353234260944 | 0.518 |
| 0.4147690568425406 | 0.887 |
| 0.3227293629432014 | 0.905 |
| 0.18658369106219486 | 0.457 |
| 0.056799400256514976 | 0.914 |
| 0.12902408574634117 | 0.643 |
| 0.38055441692237324 | 0.826 |
| 0.49545053060528976 | 0.921 |
| 0.19544661532354568 | 0.548 |
| 0.473772240834059 | 0.867 |
| 0.21699277587359156 | 0.876 |
| 0.2881691423423036 | 0.61 |
| 0.2505830597229124 | 0.839 |
| 0.3976469203168089 | 0.903 |
| 0.4499664940067234 | 0.834 |
| 0.20798389626352054 | 0.949 |
| 0.33770703724746043 | 0.831 |
| 0.13045684108962896 | 0.761 |
| 0.40787438653920627 | 0.896 |
| 0.10520688754684615 | 0.877 |
| 0.10226380096641119 | 0.821 |
| 0.17172283398002686 | 0.942 |
| 0.3598393672675463 | 0.795 |
| 0.23161262618948109 | 0.773 |
| 0.04104734460406123 | 0.977 |
| 0.25659802311908453 | 0.7 |
| 0.035190471321280725 | 0.905 |